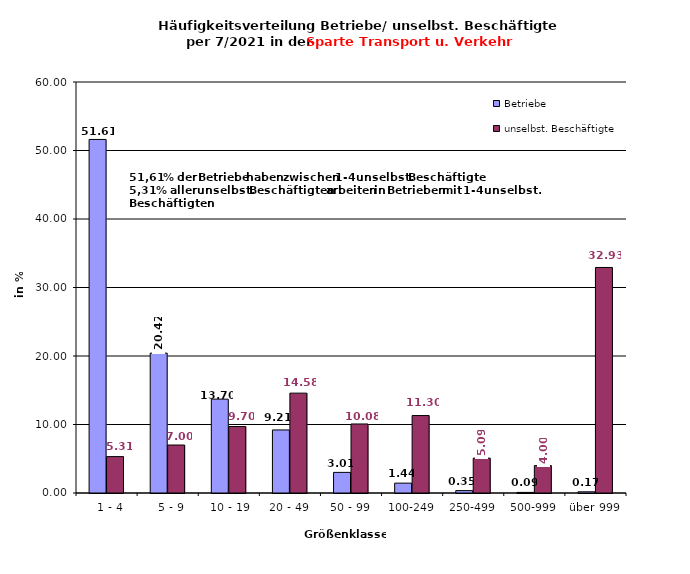
| Category | Betriebe | unselbst. Beschäftigte |
|---|---|---|
|   1 - 4 | 51.614 | 5.313 |
|   5 - 9 | 20.419 | 7.003 |
|  10 - 19 | 13.7 | 9.703 |
| 20 - 49 | 9.206 | 14.579 |
| 50 - 99 | 3.01 | 10.075 |
| 100-249 | 1.44 | 11.305 |
| 250-499 | 0.349 | 5.093 |
| 500-999 | 0.087 | 4.002 |
| über 999 | 0.175 | 32.926 |